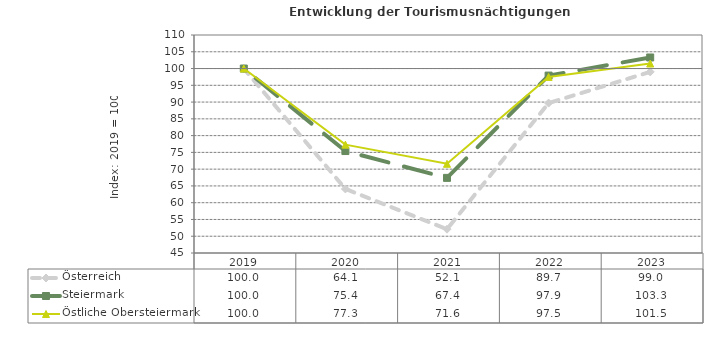
| Category | Österreich | Steiermark | Östliche Obersteiermark |
|---|---|---|---|
| 2023.0 | 99 | 103.3 | 101.5 |
| 2022.0 | 89.7 | 97.9 | 97.5 |
| 2021.0 | 52.1 | 67.4 | 71.6 |
| 2020.0 | 64.1 | 75.4 | 77.3 |
| 2019.0 | 100 | 100 | 100 |